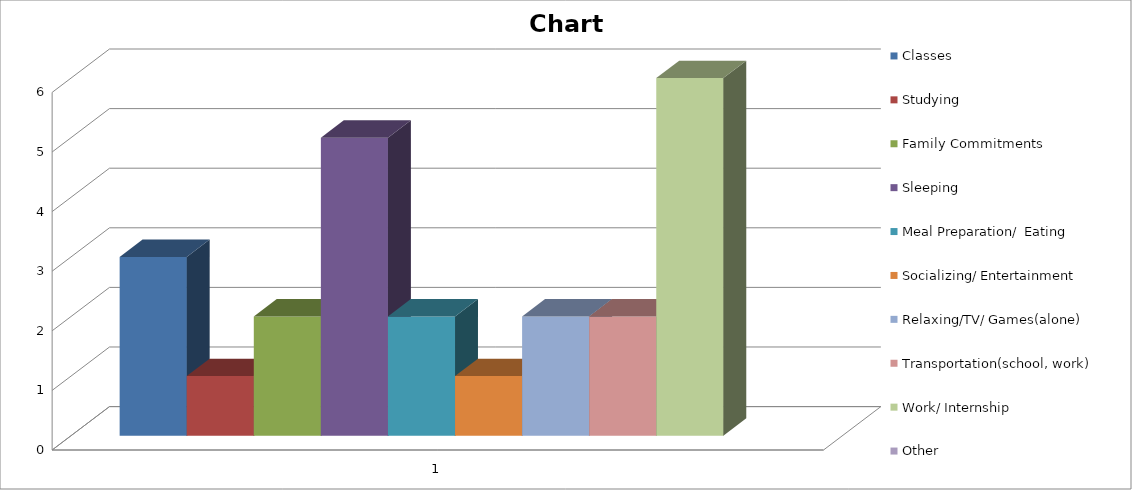
| Category | Classes | Studying | Family Commitments | Sleeping | Meal Preparation/  Eating | Socializing/ Entertainment | Relaxing/TV/ Games(alone) | Transportation(school, work) | Work/ Internship | Other |
|---|---|---|---|---|---|---|---|---|---|---|
| 0 | 3 | 1 | 2 | 5 | 2 | 1 | 2 | 2 | 6 |  |